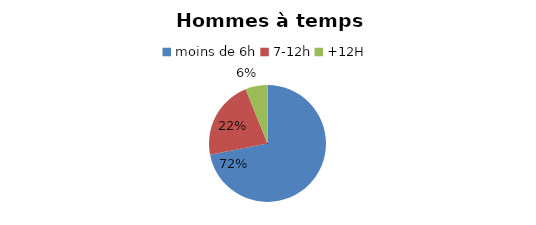
| Category | Hommes temps plein |
|---|---|
| moins de 6h | 71.95 |
| 7-12h | 21.98 |
| +12H | 6.07 |